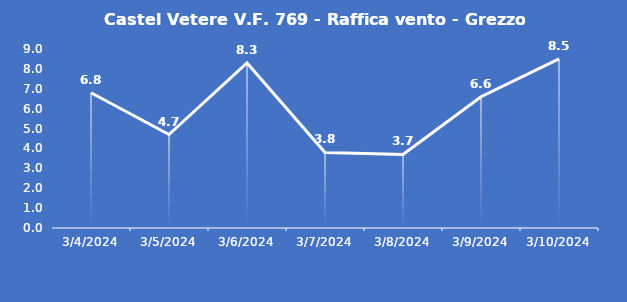
| Category | Castel Vetere V.F. 769 - Raffica vento - Grezzo (m/s) |
|---|---|
| 3/4/24 | 6.8 |
| 3/5/24 | 4.7 |
| 3/6/24 | 8.3 |
| 3/7/24 | 3.8 |
| 3/8/24 | 3.7 |
| 3/9/24 | 6.6 |
| 3/10/24 | 8.5 |